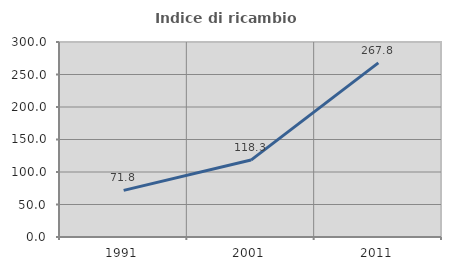
| Category | Indice di ricambio occupazionale  |
|---|---|
| 1991.0 | 71.77 |
| 2001.0 | 118.343 |
| 2011.0 | 267.826 |